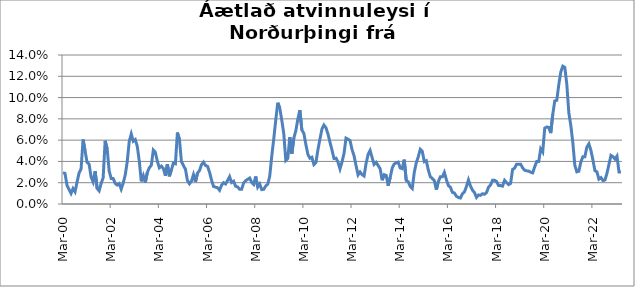
| Category | Series 0 |
|---|---|
| 2000-03-01 | 0.03 |
| 2000-04-01 | 0.029 |
| 2000-05-01 | 0.017 |
| 2000-06-01 | 0.014 |
| 2000-07-01 | 0.01 |
| 2000-08-01 | 0.015 |
| 2000-09-01 | 0.011 |
| 2000-10-01 | 0.021 |
| 2000-11-01 | 0.029 |
| 2000-12-01 | 0.033 |
| 2001-01-01 | 0.061 |
| 2001-02-01 | 0.05 |
| 2001-03-01 | 0.039 |
| 2001-04-01 | 0.038 |
| 2001-05-01 | 0.025 |
| 2001-06-01 | 0.021 |
| 2001-07-01 | 0.031 |
| 2001-08-01 | 0.015 |
| 2001-09-01 | 0.012 |
| 2001-10-01 | 0.019 |
| 2001-11-01 | 0.025 |
| 2001-12-01 | 0.059 |
| 2002-01-01 | 0.052 |
| 2002-02-01 | 0.031 |
| 2002-03-01 | 0.024 |
| 2002-04-01 | 0.024 |
| 2002-05-01 | 0.019 |
| 2002-06-01 | 0.018 |
| 2002-07-01 | 0.019 |
| 2002-08-01 | 0.014 |
| 2002-09-01 | 0.02 |
| 2002-10-01 | 0.027 |
| 2002-11-01 | 0.04 |
| 2002-12-01 | 0.059 |
| 2003-01-01 | 0.066 |
| 2003-02-01 | 0.059 |
| 2003-03-01 | 0.061 |
| 2003-04-01 | 0.054 |
| 2003-05-01 | 0.04 |
| 2003-06-01 | 0.021 |
| 2003-07-01 | 0.027 |
| 2003-08-01 | 0.02 |
| 2003-09-01 | 0.03 |
| 2003-10-01 | 0.034 |
| 2003-11-01 | 0.036 |
| 2003-12-01 | 0.051 |
| 2004-01-01 | 0.049 |
| 2004-02-01 | 0.04 |
| 2004-03-01 | 0.034 |
| 2004-04-01 | 0.036 |
| 2004-05-01 | 0.033 |
| 2004-06-01 | 0.027 |
| 2004-07-01 | 0.037 |
| 2004-08-01 | 0.026 |
| 2004-09-01 | 0.032 |
| 2004-10-01 | 0.039 |
| 2004-11-01 | 0.038 |
| 2004-12-01 | 0.067 |
| 2005-01-01 | 0.061 |
| 2005-02-01 | 0.04 |
| 2005-03-01 | 0.036 |
| 2005-04-01 | 0.033 |
| 2005-05-01 | 0.022 |
| 2005-06-01 | 0.019 |
| 2005-07-01 | 0.021 |
| 2005-08-01 | 0.028 |
| 2005-09-01 | 0.021 |
| 2005-10-01 | 0.029 |
| 2005-11-01 | 0.031 |
| 2005-12-01 | 0.037 |
| 2006-01-01 | 0.039 |
| 2006-02-01 | 0.036 |
| 2006-03-01 | 0.035 |
| 2006-04-01 | 0.03 |
| 2006-05-01 | 0.022 |
| 2006-06-01 | 0.016 |
| 2006-07-01 | 0.016 |
| 2006-08-01 | 0.015 |
| 2006-09-01 | 0.013 |
| 2006-10-01 | 0.018 |
| 2006-11-01 | 0.02 |
| 2006-12-01 | 0.019 |
| 2007-01-01 | 0.022 |
| 2007-02-01 | 0.026 |
| 2007-03-01 | 0.02 |
| 2007-04-01 | 0.021 |
| 2007-05-01 | 0.017 |
| 2007-06-01 | 0.016 |
| 2007-07-01 | 0.014 |
| 2007-08-01 | 0.014 |
| 2007-09-01 | 0.02 |
| 2007-10-01 | 0.022 |
| 2007-11-01 | 0.023 |
| 2007-12-01 | 0.024 |
| 2008-01-01 | 0.02 |
| 2008-02-01 | 0.018 |
| 2008-03-01 | 0.026 |
| 2008-04-01 | 0.016 |
| 2008-05-01 | 0.019 |
| 2008-06-01 | 0.014 |
| 2008-07-01 | 0.014 |
| 2008-08-01 | 0.017 |
| 2008-09-01 | 0.019 |
| 2008-10-01 | 0.026 |
| 2008-11-01 | 0.045 |
| 2008-12-01 | 0.061 |
| 2009-01-01 | 0.079 |
| 2009-02-01 | 0.095 |
| 2009-03-01 | 0.09 |
| 2009-04-01 | 0.079 |
| 2009-05-01 | 0.066 |
| 2009-06-01 | 0.041 |
| 2009-07-01 | 0.043 |
| 2009-08-01 | 0.063 |
| 2009-09-01 | 0.047 |
| 2009-10-01 | 0.062 |
| 2009-11-01 | 0.069 |
| 2009-12-01 | 0.08 |
| 2010-01-01 | 0.088 |
| 2010-02-01 | 0.07 |
| 2010-03-01 | 0.066 |
| 2010-04-01 | 0.056 |
| 2010-05-01 | 0.047 |
| 2010-06-01 | 0.043 |
| 2010-07-01 | 0.044 |
| 2010-08-01 | 0.037 |
| 2010-09-01 | 0.039 |
| 2010-10-01 | 0.051 |
| 2010-11-01 | 0.061 |
| 2010-12-01 | 0.07 |
| 2011-01-01 | 0.074 |
| 2011-02-01 | 0.072 |
| 2011-03-01 | 0.066 |
| 2011-04-01 | 0.058 |
| 2011-05-01 | 0.051 |
| 2011-06-01 | 0.043 |
| 2011-07-01 | 0.043 |
| 2011-08-01 | 0.039 |
| 2011-09-01 | 0.033 |
| 2011-10-01 | 0.039 |
| 2011-11-01 | 0.047 |
| 2011-12-01 | 0.062 |
| 2012-01-01 | 0.061 |
| 2012-02-01 | 0.06 |
| 2012-03-01 | 0.051 |
| 2012-04-01 | 0.045 |
| 2012-05-01 | 0.036 |
| 2012-06-01 | 0.027 |
| 2012-07-01 | 0.03 |
| 2012-08-01 | 0.028 |
| 2012-09-01 | 0.026 |
| 2012-10-01 | 0.038 |
| 2012-11-01 | 0.046 |
| 2012-12-01 | 0.05 |
| 2013-01-01 | 0.044 |
| 2013-02-01 | 0.037 |
| 2013-03-01 | 0.039 |
| 2013-04-01 | 0.036 |
| 2013-05-01 | 0.033 |
| 2013-06-01 | 0.022 |
| 2013-07-01 | 0.028 |
| 2013-08-01 | 0.027 |
| 2013-09-01 | 0.017 |
| 2013-10-01 | 0.025 |
| 2013-11-01 | 0.034 |
| 2013-12-01 | 0.038 |
| 2014-01-01 | 0.039 |
| 2014-02-01 | 0.039 |
| 2014-03-01 | 0.034 |
| 2014-04-01 | 0.033 |
| 2014-05-01 | 0.042 |
| 2014-06-01 | 0.022 |
| 2014-07-01 | 0.021 |
| 2014-08-01 | 0.016 |
| 2014-09-01 | 0.015 |
| 2014-10-01 | 0.03 |
| 2014-11-01 | 0.039 |
| 2014-12-01 | 0.044 |
| 2015-01-01 | 0.051 |
| 2015-02-01 | 0.049 |
| 2015-03-01 | 0.04 |
| 2015-04-01 | 0.041 |
| 2015-05-01 | 0.032 |
| 2015-06-01 | 0.026 |
| 2015-07-01 | 0.024 |
| 2015-08-01 | 0.022 |
| 2015-09-01 | 0.013 |
| 2015-10-01 | 0.021 |
| 2015-11-01 | 0.026 |
| 2015-12-01 | 0.026 |
| 2016-01-01 | 0.03 |
| 2016-02-01 | 0.023 |
| 2016-03-01 | 0.017 |
| 2016-04-01 | 0.016 |
| 2016-05-01 | 0.011 |
| 2016-06-01 | 0.01 |
| 2016-07-01 | 0.007 |
| 2016-08-01 | 0.006 |
| 2016-09-01 | 0.006 |
| 2016-10-01 | 0.01 |
| 2016-11-01 | 0.011 |
| 2016-12-01 | 0.016 |
| 2017-01-01 | 0.023 |
| 2017-02-01 | 0.017 |
| 2017-03-01 | 0.013 |
| 2017-04-01 | 0.011 |
| 2017-05-01 | 0.006 |
| 2017-06-01 | 0.008 |
| 2017-07-01 | 0.008 |
| 2017-08-01 | 0.01 |
| 2017-09-01 | 0.009 |
| 2017-10-01 | 0.011 |
| 2017-11-01 | 0.016 |
| 2017-12-01 | 0.018 |
| 2018-01-01 | 0.022 |
| 2018-02-01 | 0.022 |
| 2018-03-01 | 0.021 |
| 2018-04-01 | 0.017 |
| 2018-05-01 | 0.017 |
| 2018-06-01 | 0.017 |
| 2018-07-01 | 0.022 |
| 2018-08-01 | 0.02 |
| 2018-09-01 | 0.018 |
| 2018-10-01 | 0.019 |
| 2018-11-01 | 0.033 |
| 2018-12-01 | 0.034 |
| 2019-01-01 | 0.037 |
| 2019-02-01 | 0.037 |
| 2019-03-01 | 0.037 |
| 2019-04-01 | 0.034 |
| 2019-05-01 | 0.032 |
| 2019-06-01 | 0.031 |
| 2019-07-01 | 0.031 |
| 2019-08-01 | 0.03 |
| 2019-09-01 | 0.029 |
| 2019-10-01 | 0.035 |
| 2019-11-01 | 0.04 |
| 2019-12-01 | 0.04 |
| 2020-01-01 | 0.052 |
| 2020-02-01 | 0.049 |
| 2020-03-01 | 0.071 |
| 2020-04-01 | 0.072 |
| 2020-05-01 | 0.072 |
| 2020-06-01 | 0.067 |
| 2020-07-01 | 0.084 |
| 2020-08-01 | 0.097 |
| 2020-09-01 | 0.097 |
| 2020-10-01 | 0.112 |
| 2020-11-01 | 0.124 |
| 2020-12-01 | 0.13 |
| 2021-01-01 | 0.128 |
| 2021-02-01 | 0.113 |
| 2021-03-01 | 0.086 |
| 2021-04-01 | 0.074 |
| 2021-05-01 | 0.058 |
| 2021-06-01 | 0.036 |
| 2021-07-01 | 0.03 |
| 2021-08-01 | 0.031 |
| 2021-09-01 | 0.039 |
| 2021-10-01 | 0.044 |
| 2021-11-01 | 0.044 |
| 2021-12-01 | 0.053 |
| 2022-01-01 | 0.056 |
| 2022-02-01 | 0.05 |
| 2022-03-01 | 0.041 |
| 2022-04-01 | 0.031 |
| 2022-05-01 | 0.03 |
| 2022-06-01 | 0.023 |
| 2022-07-01 | 0.025 |
| 2022-08-01 | 0.022 |
| 2022-09-01 | 0.023 |
| 2022-10-01 | 0.029 |
| 2022-11-01 | 0.037 |
| 2022-12-01 | 0.046 |
| 2023-01-01 | 0.044 |
| 2023-02-01 | 0.042 |
| 2023-03-01 | 0.045 |
| 2023-04-01 | 0.03 |
| 2023-05-01 | 0.03 |